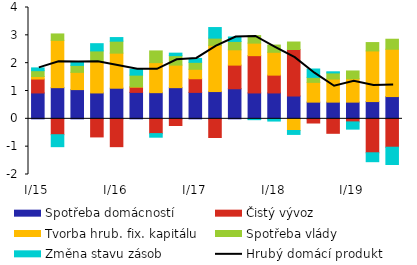
| Category | Spotřeba domácností | Čistý vývoz | Tvorba hrub. fix. kapitálu | Spotřeba vlády | Změna stavu zásob |
|---|---|---|---|---|---|
| I/15 | 0.93 | 0.5 | 0.09 | 0.21 | 0.1 |
| II | 1.12 | -0.57 | 1.7 | 0.23 | -0.43 |
| III | 1.05 | 0 | 0.62 | 0.25 | 0.12 |
| IV | 0.93 | -0.65 | 1.13 | 0.38 | 0.26 |
| I/16 | 1.1 | -1 | 1.26 | 0.43 | 0.13 |
| II | 0.95 | 0.19 | 0.01 | 0.42 | 0.21 |
| III | 0.94 | -0.53 | 1.08 | 0.42 | -0.13 |
| IV | 1.12 | -0.24 | 0.81 | 0.34 | 0.09 |
| I/17 | 0.95 | 0.49 | 0.34 | 0.25 | 0.14 |
| II | 0.98 | -0.67 | 1.66 | 0.26 | 0.38 |
| III | 1.08 | 0.85 | 0.55 | 0.3 | 0.16 |
| IV | 0.93 | 1.34 | 0.45 | 0.27 | -0.03 |
| I/18 | 0.93 | 0.64 | 0.82 | 0.26 | -0.08 |
| II | 0.82 | 1.67 | -0.42 | 0.27 | -0.14 |
| III | 0.6 | -0.15 | 0.71 | 0.18 | 0.3 |
| IV | 0.6 | -0.52 | 0.83 | 0.22 | 0.04 |
| I/19 | 0.6 | -0.11 | 0.84 | 0.28 | -0.26 |
| II | 0.62 | -1.22 | 1.82 | 0.3 | -0.32 |
| III | 0.8 | -1.02 | 1.7 | 0.36 | -0.62 |